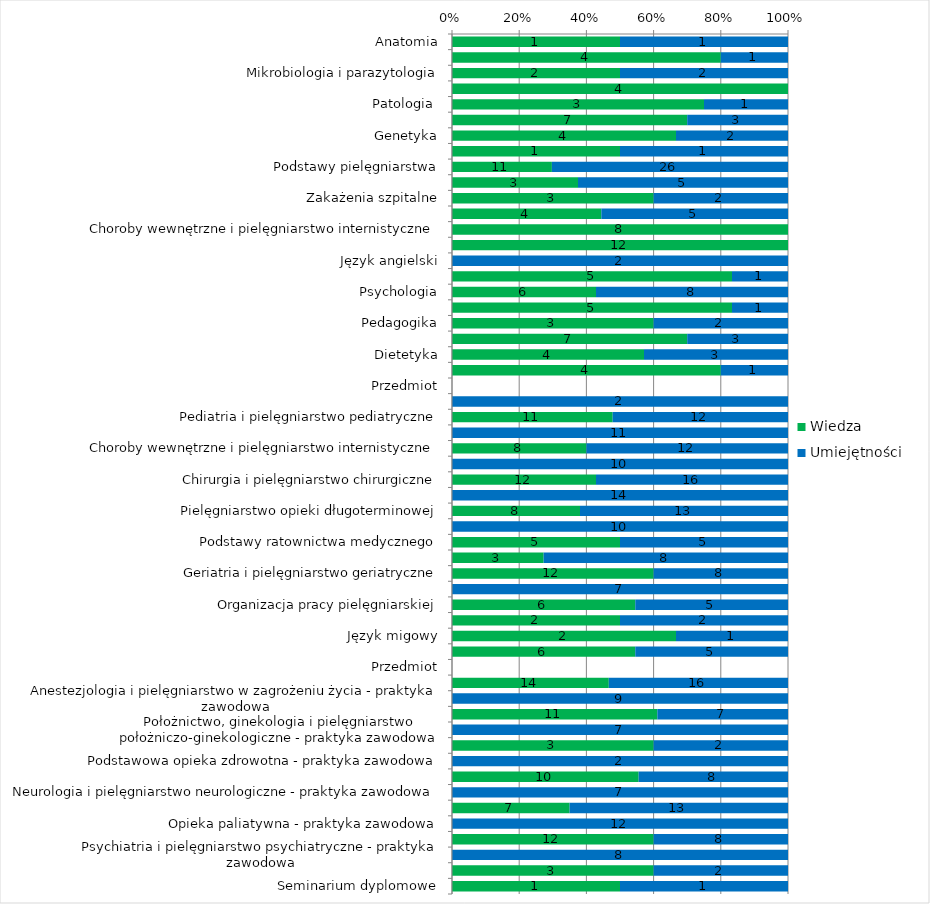
| Category | Wiedza | Umiejętności |
|---|---|---|
| Anatomia | 1 | 1 |
| Biochemia i biofizyka | 4 | 1 |
| Mikrobiologia i parazytologia | 2 | 2 |
| Fizjologia | 4 | 0 |
| Patologia  | 3 | 1 |
| Farmakologia | 7 | 3 |
| Genetyka | 4 | 2 |
| Radiologia | 1 | 1 |
| Podstawy pielęgniarstwa | 11 | 26 |
| Promocja zdrowia | 3 | 5 |
| Zakażenia szpitalne | 3 | 2 |
| Badanie fizykalne | 4 | 5 |
| Choroby wewnętrzne i pielęgniarstwo internistyczne | 8 | 0 |
| Chirurgia i pielęgniarstwo chirurgiczne | 12 | 0 |
| Język angielski | 0 | 2 |
| Prawo medyczne | 5 | 1 |
| Psychologia | 6 | 8 |
| Socjologia | 5 | 1 |
| Pedagogika | 3 | 2 |
| Zdrowie Publiczne | 7 | 3 |
| Dietetyka | 4 | 3 |
| Etyka zawodu pielęgniarki | 4 | 1 |
| Przedmiot | 0 | 0 |
| Język angielski | 0 | 2 |
| Pediatria i pielęgniarstwo pediatryczne | 11 | 12 |
| Pediatria i pielęgniarstwo pediatryczne - praktyka zawodowa | 0 | 11 |
| Choroby wewnętrzne i pielęgniarstwo internistyczne | 8 | 12 |
| Choroby wewnętrzne i pielęgniarstwo internistyczne - praktyka zawodowa | 0 | 10 |
| Chirurgia i pielęgniarstwo chirurgiczne | 12 | 16 |
| Chirurgia i pielęgniarstwo chirurgiczne - praktyka zawodowa | 0 | 14 |
| Pielęgniarstwo opieki długoterminowej | 8 | 13 |
| Pielęgniarstwo opieki długoterminowej - praktyka zwodowa | 0 | 10 |
| Podstawy ratownictwa medycznego | 5 | 5 |
| Podstawy rehabilitacji  | 3 | 8 |
| Geriatria i pielęgniarstwo geriatryczne | 12 | 8 |
| Geriatria i pielęgniarstwo geriatryczne - praktyka zawodowa | 0 | 7 |
| Organizacja pracy pielęgniarskiej | 6 | 5 |
| Systemy informacji w ochronie zdrowia | 2 | 2 |
| Język migowy | 2 | 1 |
| Współpraca w zespołach opieki zdrowotnej  | 6 | 5 |
| Przedmiot | 0 | 0 |
| Anestezjologia i pielęgniarstwo w zagrożeniu życia | 14 | 16 |
| Anestezjologia i pielęgniarstwo w zagrożeniu życia - praktyka zawodowa | 0 | 9 |
| Położnictwo, ginekologia i pielęgniarstwo położniczo-ginekologiczne | 11 | 7 |
| Położnictwo, ginekologia i pielęgniarstwo położniczo-ginekologiczne - praktyka zawodowa | 0 | 7 |
| Podstawowa opieka zdrowotna | 3 | 2 |
| Podstawowa opieka zdrowotna - praktyka zawodowa | 0 | 2 |
| Neurologia i pielęgniarstwo neurologiczne | 10 | 8 |
| Neurologia i pielęgniarstwo neurologiczne - praktyka zawodowa | 0 | 7 |
| Opieka paliatywna | 7 | 13 |
| Opieka paliatywna - praktyka zawodowa | 0 | 12 |
| Psychiatria i pielęgniarstwo psychiatryczne | 12 | 8 |
| Psychiatria i pielęgniarstwo psychiatryczne - praktyka zawodowa | 0 | 8 |
| Badania naukowe w pielęgniarstwie | 3 | 2 |
| Seminarium dyplomowe | 1 | 1 |